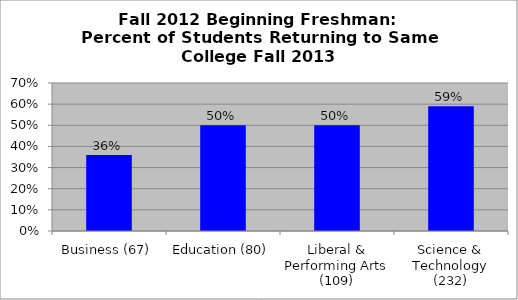
| Category | Series 0 |
|---|---|
| Business (67) | 0.36 |
| Education (80) | 0.5 |
| Liberal & Performing Arts (109) | 0.5 |
| Science & Technology (232) | 0.59 |